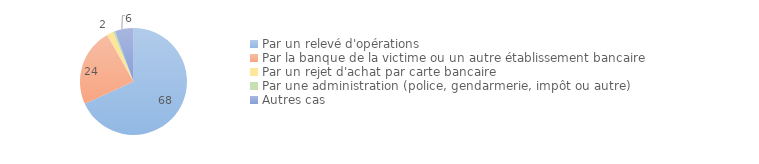
| Category | Series 0 |
|---|---|
| Par un relevé d'opérations | 68.212 |
| Par la banque de la victime ou un autre établissement bancaire | 23.615 |
| Par un rejet d'achat par carte bancaire | 1.89 |
| Par une administration (police, gendarmerie, impôt ou autre) | 0.656 |
| Autres cas | 5.628 |